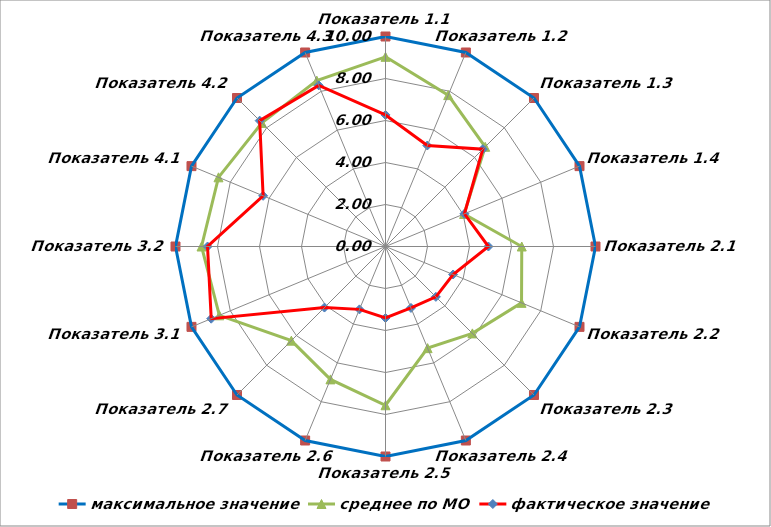
| Category | максимальное значение | среднее по МО | фактическое значение |
|---|---|---|---|
| Показатель 1.1 | 10 | 9.033 | 6.265 |
| Показатель 1.2 | 10 | 7.803 | 5.205 |
| Показатель 1.3 | 10 | 6.713 | 6.553 |
| Показатель 1.4 | 10 | 4.051 | 4.068 |
| Показатель 2.1 | 10 | 6.489 | 4.902 |
| Показатель 2.2 | 10 | 7.011 | 3.483 |
| Показатель 2.3 | 10 | 5.851 | 3.392 |
| Показатель 2.4 | 10 | 5.239 | 3.167 |
| Показатель 2.5 | 10 | 7.56 | 3.403 |
| Показатель 2.6 | 10 | 6.849 | 3.241 |
| Показатель 2.7 | 10 | 6.342 | 4.111 |
| Показатель 3.1 | 10 | 8.563 | 8.983 |
| Показатель 3.2 | 10 | 8.76 | 8.475 |
| Показатель 4.1 | 10 | 8.608 | 6.308 |
| Показатель 4.2 | 10 | 8.323 | 8.475 |
| Показатель 4.3 | 10 | 8.551 | 8.305 |